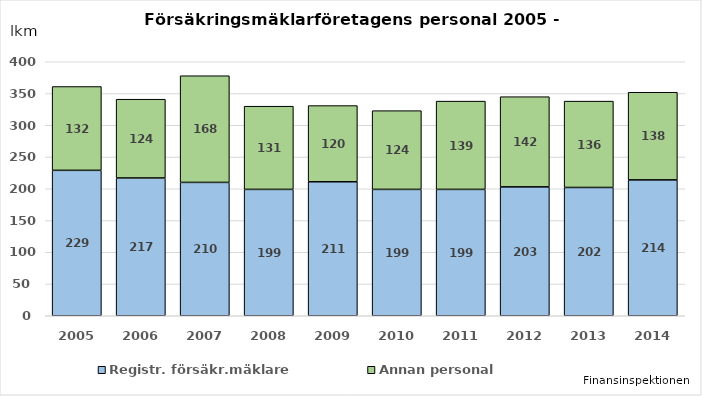
| Category | Registr. försäkr.mäklare | Annan personal |
|---|---|---|
| 2005.0 | 229 | 132 |
| 2006.0 | 217 | 124 |
| 2007.0 | 210 | 168 |
| 2008.0 | 199 | 131 |
| 2009.0 | 211 | 120 |
| 2010.0 | 199 | 124 |
| 2011.0 | 199 | 139 |
| 2012.0 | 203 | 142 |
| 2013.0 | 202 | 136 |
| 2014.0 | 214 | 138 |